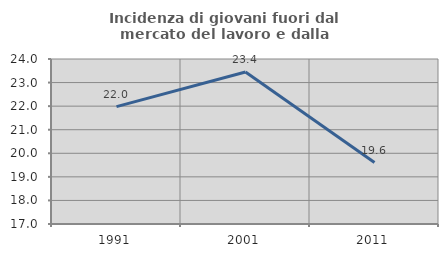
| Category | Incidenza di giovani fuori dal mercato del lavoro e dalla formazione  |
|---|---|
| 1991.0 | 21.98 |
| 2001.0 | 23.448 |
| 2011.0 | 19.608 |